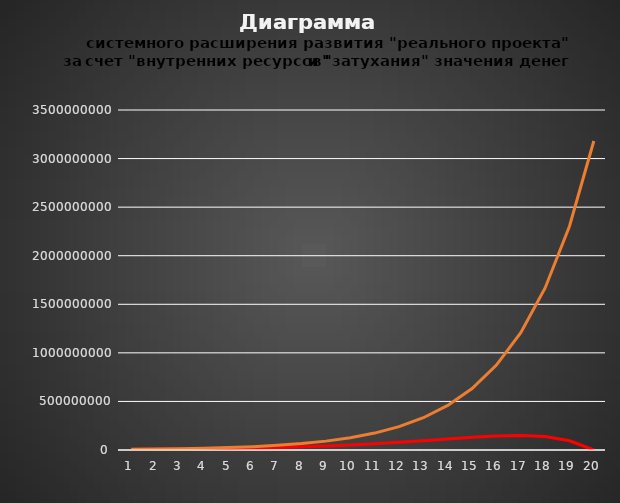
| Category | Series 0 | Series 1 |
|---|---|---|
| 0 | 5438961.721 | 6904761.905 |
| 1 | 7115634.131 | 9535147.392 |
| 2 | 9280443.457 | 13167584.494 |
| 3 | 12061976.93 | 18183807.159 |
| 4 | 15615952.275 | 25110971.79 |
| 5 | 20127227.377 | 34677056.282 |
| 6 | 25809403.813 | 47887363.437 |
| 7 | 32899899.366 | 66130168.556 |
| 8 | 41647094.833 | 91322613.72 |
| 9 | 52284231.609 | 126112180.851 |
| 10 | 64981830.713 | 174154916.414 |
| 11 | 79766056.749 | 240499646.476 |
| 12 | 96383985.238 | 332118559.419 |
| 13 | 114087166.2 | 458639915.389 |
| 14 | 131290786.5 | 633359883.156 |
| 15 | 145045059.372 | 874639838.644 |
| 16 | 150225240.064 | 1207835967.651 |
| 17 | 138302601.963 | 1667963955.327 |
| 18 | 95494653.737 | 2303378795.452 |
| 19 | 0 | 3180856431.814 |